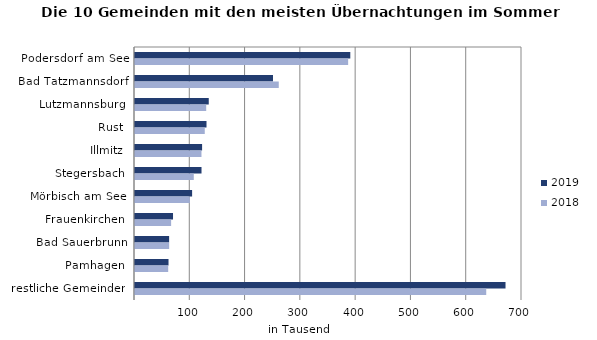
| Category | 2019 | 2018 |
|---|---|---|
| Podersdorf am See | 389429 | 385537 |
| Bad Tatzmannsdorf | 249599 | 260055 |
| Lutzmannsburg | 133406 | 128804 |
| Rust | 129340 | 126197 |
| Illmitz | 121360 | 120227 |
| Stegersbach | 120308 | 106319 |
| Mörbisch am See | 103305 | 99256 |
| Frauenkirchen | 68768 | 65333 |
| Bad Sauerbrunn | 61724 | 61806 |
| Pamhagen | 60632 | 60054 |
| restliche Gemeinden | 670187 | 635306 |